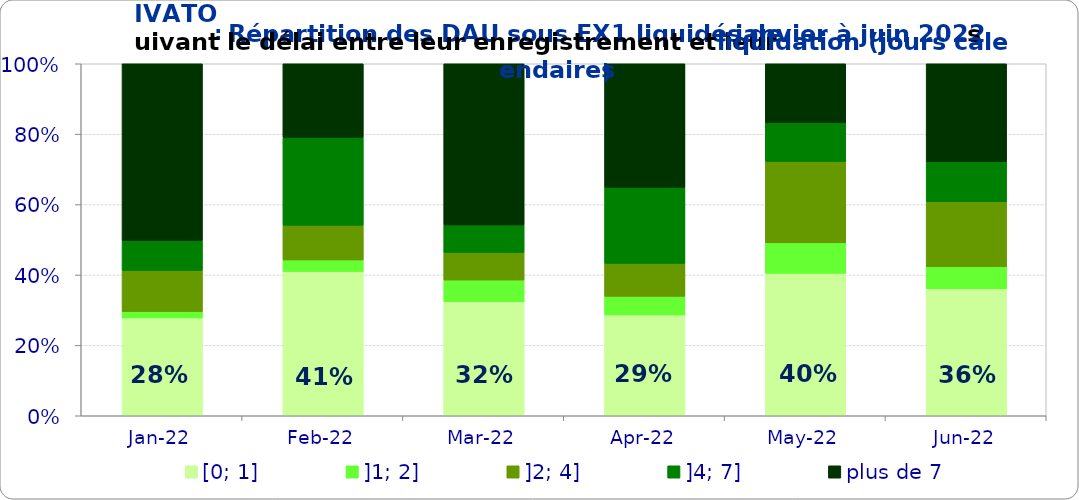
| Category | [0; 1] | ]1; 2] | ]2; 4] | ]4; 7] | plus de 7 |
|---|---|---|---|---|---|
| 2022-01-01 | 0.278 | 0.018 | 0.117 | 0.085 | 0.502 |
| 2022-02-01 | 0.41 | 0.033 | 0.098 | 0.25 | 0.209 |
| 2022-03-01 | 0.324 | 0.061 | 0.078 | 0.078 | 0.458 |
| 2022-04-01 | 0.287 | 0.053 | 0.094 | 0.216 | 0.351 |
| 2022-05-01 | 0.405 | 0.087 | 0.231 | 0.11 | 0.168 |
| 2022-06-01 | 0.361 | 0.063 | 0.184 | 0.114 | 0.278 |